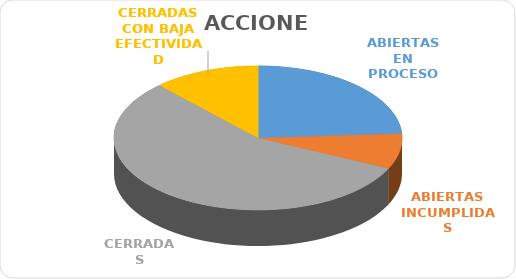
| Category | No. |
|---|---|
| ABIERTAS EN PROCESO | 6 |
| ABIERTAS INCUMPLIDAS | 2 |
| CERRADAS | 14 |
| CERRADAS CON BAJA EFECTIVIDAD | 3 |